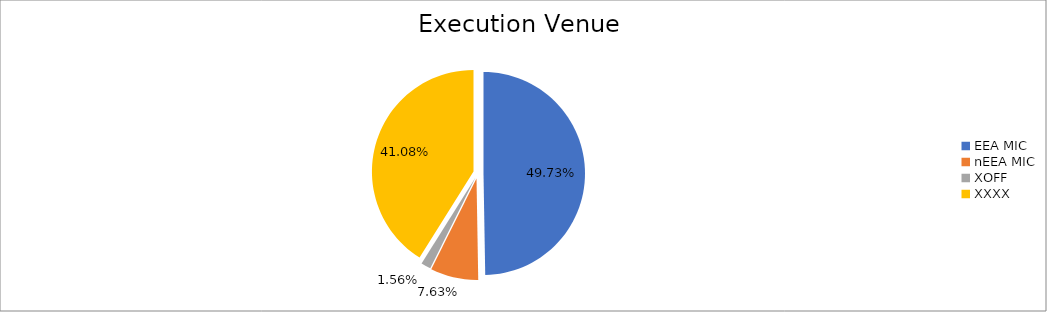
| Category | Series 0 |
|---|---|
| EEA MIC | 5545859.796 |
| nEEA MIC | 850736.248 |
| XOFF | 174498.198 |
| XXXX | 4581747.347 |